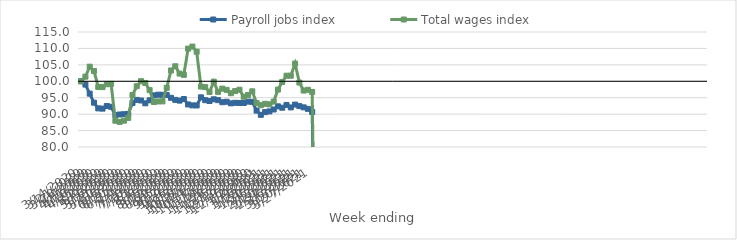
| Category | Payroll jobs index | Total wages index |
|---|---|---|
| 14/03/2020 | 100 | 100 |
| 21/03/2020 | 98.994 | 101.401 |
| 28/03/2020 | 96.24 | 104.448 |
| 04/04/2020 | 93.488 | 103.126 |
| 11/04/2020 | 91.753 | 98.26 |
| 18/04/2020 | 91.682 | 98.224 |
| 25/04/2020 | 92.478 | 99.091 |
| 02/05/2020 | 92.235 | 99.198 |
| 09/05/2020 | 89.693 | 87.995 |
| 16/05/2020 | 89.891 | 87.66 |
| 23/05/2020 | 89.972 | 88.014 |
| 30/05/2020 | 90.074 | 88.855 |
| 06/06/2020 | 93.379 | 95.8 |
| 13/06/2020 | 94.336 | 98.502 |
| 20/06/2020 | 94.155 | 100.023 |
| 27/06/2020 | 93.292 | 99.492 |
| 04/07/2020 | 94.212 | 97.319 |
| 11/07/2020 | 95.703 | 93.691 |
| 18/07/2020 | 95.918 | 93.866 |
| 25/07/2020 | 95.902 | 93.885 |
| 01/08/2020 | 95.812 | 98.02 |
| 08/08/2020 | 94.973 | 103.277 |
| 15/08/2020 | 94.344 | 104.572 |
| 22/08/2020 | 94.12 | 102.342 |
| 29/08/2020 | 94.605 | 101.956 |
| 05/09/2020 | 92.95 | 109.94 |
| 12/09/2020 | 92.666 | 110.565 |
| 19/09/2020 | 92.64 | 109.006 |
| 26/09/2020 | 95.125 | 98.398 |
| 03/10/2020 | 94.246 | 98.224 |
| 10/10/2020 | 94 | 96.733 |
| 17/10/2020 | 94.527 | 99.872 |
| 24/10/2020 | 94.26 | 96.768 |
| 31/10/2020 | 93.627 | 97.769 |
| 07/11/2020 | 93.772 | 97.387 |
| 14/11/2020 | 93.289 | 96.372 |
| 21/11/2020 | 93.458 | 97.028 |
| 28/11/2020 | 93.406 | 97.432 |
| 05/12/2020 | 93.401 | 95.275 |
| 12/12/2020 | 93.811 | 95.843 |
| 19/12/2020 | 93.756 | 96.952 |
| 26/12/2020 | 91.075 | 93.359 |
| 02/01/2021 | 89.793 | 92.721 |
| 09/01/2021 | 90.608 | 93.157 |
| 16/01/2021 | 90.832 | 92.986 |
| 23/01/2021 | 91.417 | 93.825 |
| 30/01/2021 | 92.377 | 97.48 |
| 06/02/2021 | 91.954 | 99.795 |
| 13/02/2021 | 92.8 | 101.703 |
| 20/02/2021 | 92.045 | 101.7 |
| 27/02/2021 | 92.909 | 105.392 |
| 06/03/2021 | 92.443 | 99.616 |
| 13/03/2021 | 92.067 | 97.178 |
| 20/03/2021 | 91.606 | 97.415 |
| 27/03/2021 | 90.658 | 96.759 |